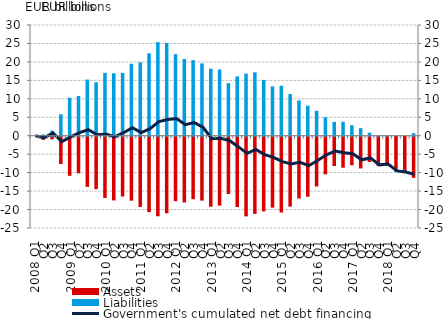
| Category | Assets | Liabilities |
|---|---|---|
| 2008 Q1 | 0 | 0 |
| Q2 | -0.851 | 0.337 |
| Q3 | -0.698 | 1.39 |
| Q4 | -7.383 | 5.802 |
| 2009 Q1 | -10.588 | 10.291 |
| Q2 | -9.918 | 10.776 |
| Q3 | -13.585 | 15.207 |
| Q4 | -14.207 | 14.485 |
| 2010 Q1 | -16.589 | 17.029 |
| Q2 | -17.255 | 16.921 |
| Q3 | -16.201 | 17.019 |
| Q4 | -17.327 | 19.493 |
| 2011 Q1 | -19.023 | 19.892 |
| Q2 | -20.434 | 22.342 |
| Q3 | -21.552 | 25.368 |
| Q4 | -20.744 | 25.148 |
| 2012 Q1 | -17.452 | 22.1 |
| Q2 | -17.803 | 20.791 |
| Q3 | -16.919 | 20.478 |
| Q4 | -17.305 | 19.594 |
| 2013 Q1 | -18.967 | 18.165 |
| Q2 | -18.657 | 17.945 |
| Q3 | -15.517 | 14.234 |
| Q4 | -19.044 | 16.078 |
| 2014 Q1 | -21.576 | 16.806 |
| Q2 | -20.902 | 17.179 |
| Q3 | -20.231 | 15.101 |
| Q4 | -19.214 | 13.372 |
| 2015 Q1 | -20.524 | 13.517 |
| Q2 | -18.928 | 11.298 |
| Q3 | -16.746 | 9.531 |
| Q4 | -16.249 | 8.129 |
| 2016 Q1 | -13.479 | 6.745 |
| Q2 | -10.189 | 5.006 |
| Q3 | -7.934 | 3.767 |
| Q4 | -8.398 | 3.778 |
| 2017 Q1 | -7.739 | 2.842 |
| Q2 | -8.585 | 2.058 |
| Q3 | -6.851 | 0.837 |
| Q4 | -7.951 | 0.066 |
| 2018 Q1 | -7.79 | 0.126 |
| Q2 | -9.071 | -0.46 |
| Q3 | -9.343 | -0.467 |
| Q4 | -11.145 | 0.681 |